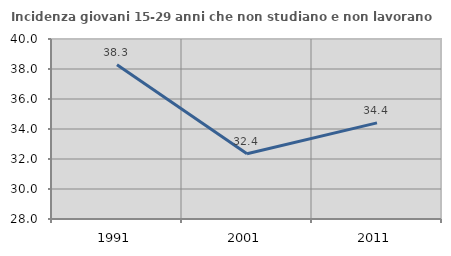
| Category | Incidenza giovani 15-29 anni che non studiano e non lavorano  |
|---|---|
| 1991.0 | 38.29 |
| 2001.0 | 32.353 |
| 2011.0 | 34.409 |